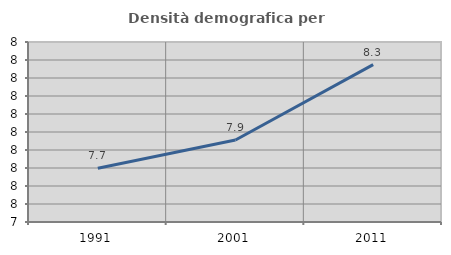
| Category | Densità demografica |
|---|---|
| 1991.0 | 7.699 |
| 2001.0 | 7.855 |
| 2011.0 | 8.274 |